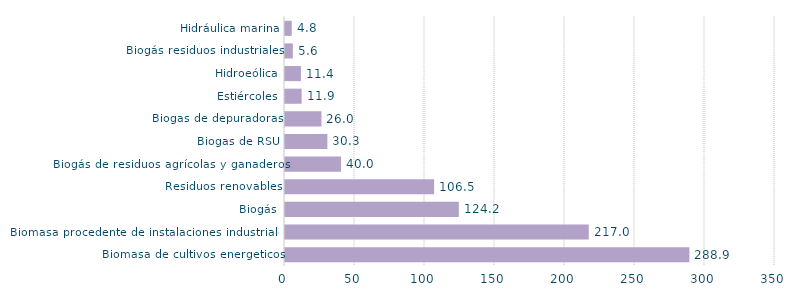
| Category | Series 0 |
|---|---|
| Biomasa de cultivos energeticos | 288.858 |
| Biomasa procedente de instalaciones industriales | 216.956 |
| Biogás | 124.161 |
| Residuos renovables | 106.526 |
| Biogás de residuos agrícolas y ganaderos | 40.029 |
| Biogas de RSU | 30.269 |
| Biogas de depuradoras | 26.049 |
| Estiércoles | 11.898 |
| Hidroeólica | 11.39 |
| Biogás residuos industriales | 5.599 |
| Hidráulica marina | 4.796 |